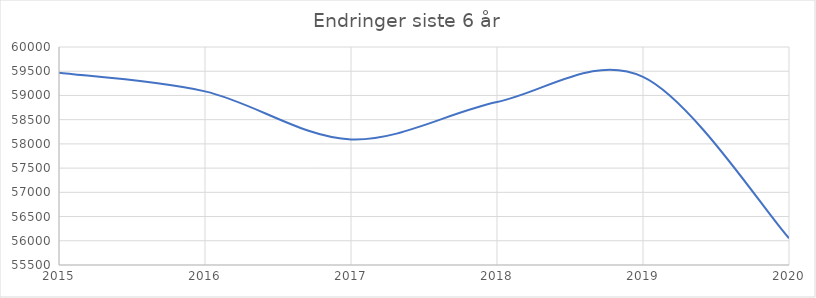
| Category | Series 0 |
|---|---|
| 2015.0 | 59468 |
| 2016.0 | 59084 |
| 2017.0 | 58093 |
| 2018.0 | 58863 |
| 2019.0 | 59383 |
| 2020.0 | 56052 |